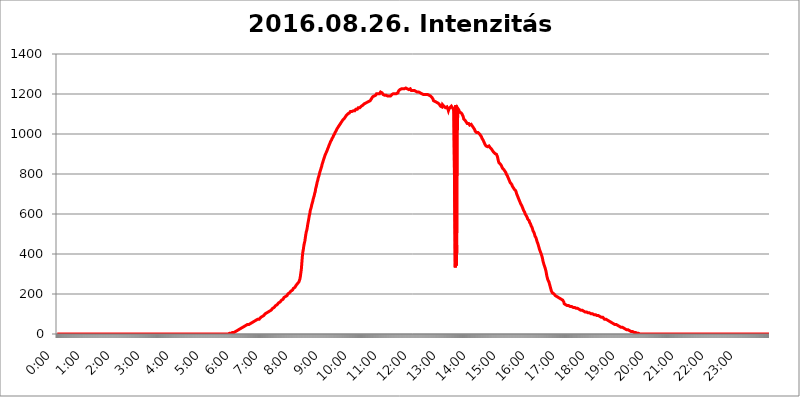
| Category | 2016.08.26. Intenzitás [W/m^2] |
|---|---|
| 0.0 | 0 |
| 0.0006944444444444445 | 0 |
| 0.001388888888888889 | 0 |
| 0.0020833333333333333 | 0 |
| 0.002777777777777778 | 0 |
| 0.003472222222222222 | 0 |
| 0.004166666666666667 | 0 |
| 0.004861111111111111 | 0 |
| 0.005555555555555556 | 0 |
| 0.0062499999999999995 | 0 |
| 0.006944444444444444 | 0 |
| 0.007638888888888889 | 0 |
| 0.008333333333333333 | 0 |
| 0.009027777777777779 | 0 |
| 0.009722222222222222 | 0 |
| 0.010416666666666666 | 0 |
| 0.011111111111111112 | 0 |
| 0.011805555555555555 | 0 |
| 0.012499999999999999 | 0 |
| 0.013194444444444444 | 0 |
| 0.013888888888888888 | 0 |
| 0.014583333333333332 | 0 |
| 0.015277777777777777 | 0 |
| 0.015972222222222224 | 0 |
| 0.016666666666666666 | 0 |
| 0.017361111111111112 | 0 |
| 0.018055555555555557 | 0 |
| 0.01875 | 0 |
| 0.019444444444444445 | 0 |
| 0.02013888888888889 | 0 |
| 0.020833333333333332 | 0 |
| 0.02152777777777778 | 0 |
| 0.022222222222222223 | 0 |
| 0.02291666666666667 | 0 |
| 0.02361111111111111 | 0 |
| 0.024305555555555556 | 0 |
| 0.024999999999999998 | 0 |
| 0.025694444444444447 | 0 |
| 0.02638888888888889 | 0 |
| 0.027083333333333334 | 0 |
| 0.027777777777777776 | 0 |
| 0.02847222222222222 | 0 |
| 0.029166666666666664 | 0 |
| 0.029861111111111113 | 0 |
| 0.030555555555555555 | 0 |
| 0.03125 | 0 |
| 0.03194444444444445 | 0 |
| 0.03263888888888889 | 0 |
| 0.03333333333333333 | 0 |
| 0.034027777777777775 | 0 |
| 0.034722222222222224 | 0 |
| 0.035416666666666666 | 0 |
| 0.036111111111111115 | 0 |
| 0.03680555555555556 | 0 |
| 0.0375 | 0 |
| 0.03819444444444444 | 0 |
| 0.03888888888888889 | 0 |
| 0.03958333333333333 | 0 |
| 0.04027777777777778 | 0 |
| 0.04097222222222222 | 0 |
| 0.041666666666666664 | 0 |
| 0.042361111111111106 | 0 |
| 0.04305555555555556 | 0 |
| 0.043750000000000004 | 0 |
| 0.044444444444444446 | 0 |
| 0.04513888888888889 | 0 |
| 0.04583333333333334 | 0 |
| 0.04652777777777778 | 0 |
| 0.04722222222222222 | 0 |
| 0.04791666666666666 | 0 |
| 0.04861111111111111 | 0 |
| 0.049305555555555554 | 0 |
| 0.049999999999999996 | 0 |
| 0.05069444444444445 | 0 |
| 0.051388888888888894 | 0 |
| 0.052083333333333336 | 0 |
| 0.05277777777777778 | 0 |
| 0.05347222222222222 | 0 |
| 0.05416666666666667 | 0 |
| 0.05486111111111111 | 0 |
| 0.05555555555555555 | 0 |
| 0.05625 | 0 |
| 0.05694444444444444 | 0 |
| 0.057638888888888885 | 0 |
| 0.05833333333333333 | 0 |
| 0.05902777777777778 | 0 |
| 0.059722222222222225 | 0 |
| 0.06041666666666667 | 0 |
| 0.061111111111111116 | 0 |
| 0.06180555555555556 | 0 |
| 0.0625 | 0 |
| 0.06319444444444444 | 0 |
| 0.06388888888888888 | 0 |
| 0.06458333333333334 | 0 |
| 0.06527777777777778 | 0 |
| 0.06597222222222222 | 0 |
| 0.06666666666666667 | 0 |
| 0.06736111111111111 | 0 |
| 0.06805555555555555 | 0 |
| 0.06874999999999999 | 0 |
| 0.06944444444444443 | 0 |
| 0.07013888888888889 | 0 |
| 0.07083333333333333 | 0 |
| 0.07152777777777779 | 0 |
| 0.07222222222222223 | 0 |
| 0.07291666666666667 | 0 |
| 0.07361111111111111 | 0 |
| 0.07430555555555556 | 0 |
| 0.075 | 0 |
| 0.07569444444444444 | 0 |
| 0.0763888888888889 | 0 |
| 0.07708333333333334 | 0 |
| 0.07777777777777778 | 0 |
| 0.07847222222222222 | 0 |
| 0.07916666666666666 | 0 |
| 0.0798611111111111 | 0 |
| 0.08055555555555556 | 0 |
| 0.08125 | 0 |
| 0.08194444444444444 | 0 |
| 0.08263888888888889 | 0 |
| 0.08333333333333333 | 0 |
| 0.08402777777777777 | 0 |
| 0.08472222222222221 | 0 |
| 0.08541666666666665 | 0 |
| 0.08611111111111112 | 0 |
| 0.08680555555555557 | 0 |
| 0.08750000000000001 | 0 |
| 0.08819444444444445 | 0 |
| 0.08888888888888889 | 0 |
| 0.08958333333333333 | 0 |
| 0.09027777777777778 | 0 |
| 0.09097222222222222 | 0 |
| 0.09166666666666667 | 0 |
| 0.09236111111111112 | 0 |
| 0.09305555555555556 | 0 |
| 0.09375 | 0 |
| 0.09444444444444444 | 0 |
| 0.09513888888888888 | 0 |
| 0.09583333333333333 | 0 |
| 0.09652777777777777 | 0 |
| 0.09722222222222222 | 0 |
| 0.09791666666666667 | 0 |
| 0.09861111111111111 | 0 |
| 0.09930555555555555 | 0 |
| 0.09999999999999999 | 0 |
| 0.10069444444444443 | 0 |
| 0.1013888888888889 | 0 |
| 0.10208333333333335 | 0 |
| 0.10277777777777779 | 0 |
| 0.10347222222222223 | 0 |
| 0.10416666666666667 | 0 |
| 0.10486111111111111 | 0 |
| 0.10555555555555556 | 0 |
| 0.10625 | 0 |
| 0.10694444444444444 | 0 |
| 0.1076388888888889 | 0 |
| 0.10833333333333334 | 0 |
| 0.10902777777777778 | 0 |
| 0.10972222222222222 | 0 |
| 0.1111111111111111 | 0 |
| 0.11180555555555556 | 0 |
| 0.11180555555555556 | 0 |
| 0.1125 | 0 |
| 0.11319444444444444 | 0 |
| 0.11388888888888889 | 0 |
| 0.11458333333333333 | 0 |
| 0.11527777777777777 | 0 |
| 0.11597222222222221 | 0 |
| 0.11666666666666665 | 0 |
| 0.1173611111111111 | 0 |
| 0.11805555555555557 | 0 |
| 0.11944444444444445 | 0 |
| 0.12013888888888889 | 0 |
| 0.12083333333333333 | 0 |
| 0.12152777777777778 | 0 |
| 0.12222222222222223 | 0 |
| 0.12291666666666667 | 0 |
| 0.12291666666666667 | 0 |
| 0.12361111111111112 | 0 |
| 0.12430555555555556 | 0 |
| 0.125 | 0 |
| 0.12569444444444444 | 0 |
| 0.12638888888888888 | 0 |
| 0.12708333333333333 | 0 |
| 0.16875 | 0 |
| 0.12847222222222224 | 0 |
| 0.12916666666666668 | 0 |
| 0.12986111111111112 | 0 |
| 0.13055555555555556 | 0 |
| 0.13125 | 0 |
| 0.13194444444444445 | 0 |
| 0.1326388888888889 | 0 |
| 0.13333333333333333 | 0 |
| 0.13402777777777777 | 0 |
| 0.13402777777777777 | 0 |
| 0.13472222222222222 | 0 |
| 0.13541666666666666 | 0 |
| 0.1361111111111111 | 0 |
| 0.13749999999999998 | 0 |
| 0.13819444444444443 | 0 |
| 0.1388888888888889 | 0 |
| 0.13958333333333334 | 0 |
| 0.14027777777777778 | 0 |
| 0.14097222222222222 | 0 |
| 0.14166666666666666 | 0 |
| 0.1423611111111111 | 0 |
| 0.14305555555555557 | 0 |
| 0.14375000000000002 | 0 |
| 0.14444444444444446 | 0 |
| 0.1451388888888889 | 0 |
| 0.1451388888888889 | 0 |
| 0.14652777777777778 | 0 |
| 0.14722222222222223 | 0 |
| 0.14791666666666667 | 0 |
| 0.1486111111111111 | 0 |
| 0.14930555555555555 | 0 |
| 0.15 | 0 |
| 0.15069444444444444 | 0 |
| 0.15138888888888888 | 0 |
| 0.15208333333333332 | 0 |
| 0.15277777777777776 | 0 |
| 0.15347222222222223 | 0 |
| 0.15416666666666667 | 0 |
| 0.15486111111111112 | 0 |
| 0.15555555555555556 | 0 |
| 0.15625 | 0 |
| 0.15694444444444444 | 0 |
| 0.15763888888888888 | 0 |
| 0.15833333333333333 | 0 |
| 0.15902777777777777 | 0 |
| 0.15972222222222224 | 0 |
| 0.16041666666666668 | 0 |
| 0.16111111111111112 | 0 |
| 0.16180555555555556 | 0 |
| 0.1625 | 0 |
| 0.16319444444444445 | 0 |
| 0.1638888888888889 | 0 |
| 0.16458333333333333 | 0 |
| 0.16527777777777777 | 0 |
| 0.16597222222222222 | 0 |
| 0.16666666666666666 | 0 |
| 0.1673611111111111 | 0 |
| 0.16805555555555554 | 0 |
| 0.16874999999999998 | 0 |
| 0.16944444444444443 | 0 |
| 0.17013888888888887 | 0 |
| 0.1708333333333333 | 0 |
| 0.17152777777777775 | 0 |
| 0.17222222222222225 | 0 |
| 0.1729166666666667 | 0 |
| 0.17361111111111113 | 0 |
| 0.17430555555555557 | 0 |
| 0.17500000000000002 | 0 |
| 0.17569444444444446 | 0 |
| 0.1763888888888889 | 0 |
| 0.17708333333333334 | 0 |
| 0.17777777777777778 | 0 |
| 0.17847222222222223 | 0 |
| 0.17916666666666667 | 0 |
| 0.1798611111111111 | 0 |
| 0.18055555555555555 | 0 |
| 0.18125 | 0 |
| 0.18194444444444444 | 0 |
| 0.1826388888888889 | 0 |
| 0.18333333333333335 | 0 |
| 0.1840277777777778 | 0 |
| 0.18472222222222223 | 0 |
| 0.18541666666666667 | 0 |
| 0.18611111111111112 | 0 |
| 0.18680555555555556 | 0 |
| 0.1875 | 0 |
| 0.18819444444444444 | 0 |
| 0.18888888888888888 | 0 |
| 0.18958333333333333 | 0 |
| 0.19027777777777777 | 0 |
| 0.1909722222222222 | 0 |
| 0.19166666666666665 | 0 |
| 0.19236111111111112 | 0 |
| 0.19305555555555554 | 0 |
| 0.19375 | 0 |
| 0.19444444444444445 | 0 |
| 0.1951388888888889 | 0 |
| 0.19583333333333333 | 0 |
| 0.19652777777777777 | 0 |
| 0.19722222222222222 | 0 |
| 0.19791666666666666 | 0 |
| 0.1986111111111111 | 0 |
| 0.19930555555555554 | 0 |
| 0.19999999999999998 | 0 |
| 0.20069444444444443 | 0 |
| 0.20138888888888887 | 0 |
| 0.2020833333333333 | 0 |
| 0.2027777777777778 | 0 |
| 0.2034722222222222 | 0 |
| 0.2041666666666667 | 0 |
| 0.20486111111111113 | 0 |
| 0.20555555555555557 | 0 |
| 0.20625000000000002 | 0 |
| 0.20694444444444446 | 0 |
| 0.2076388888888889 | 0 |
| 0.20833333333333334 | 0 |
| 0.20902777777777778 | 0 |
| 0.20972222222222223 | 0 |
| 0.21041666666666667 | 0 |
| 0.2111111111111111 | 0 |
| 0.21180555555555555 | 0 |
| 0.2125 | 0 |
| 0.21319444444444444 | 0 |
| 0.2138888888888889 | 0 |
| 0.21458333333333335 | 0 |
| 0.2152777777777778 | 0 |
| 0.21597222222222223 | 0 |
| 0.21666666666666667 | 0 |
| 0.21736111111111112 | 0 |
| 0.21805555555555556 | 0 |
| 0.21875 | 0 |
| 0.21944444444444444 | 0 |
| 0.22013888888888888 | 0 |
| 0.22083333333333333 | 0 |
| 0.22152777777777777 | 0 |
| 0.2222222222222222 | 0 |
| 0.22291666666666665 | 0 |
| 0.2236111111111111 | 0 |
| 0.22430555555555556 | 0 |
| 0.225 | 0 |
| 0.22569444444444445 | 0 |
| 0.2263888888888889 | 0 |
| 0.22708333333333333 | 0 |
| 0.22777777777777777 | 0 |
| 0.22847222222222222 | 0 |
| 0.22916666666666666 | 0 |
| 0.2298611111111111 | 0 |
| 0.23055555555555554 | 0 |
| 0.23124999999999998 | 0 |
| 0.23194444444444443 | 0 |
| 0.23263888888888887 | 0 |
| 0.2333333333333333 | 0 |
| 0.2340277777777778 | 0 |
| 0.2347222222222222 | 0 |
| 0.2354166666666667 | 0 |
| 0.23611111111111113 | 0 |
| 0.23680555555555557 | 0 |
| 0.23750000000000002 | 0 |
| 0.23819444444444446 | 0 |
| 0.2388888888888889 | 3.525 |
| 0.23958333333333334 | 0 |
| 0.24027777777777778 | 3.525 |
| 0.24097222222222223 | 3.525 |
| 0.24166666666666667 | 3.525 |
| 0.2423611111111111 | 3.525 |
| 0.24305555555555555 | 3.525 |
| 0.24375 | 3.525 |
| 0.24444444444444446 | 3.525 |
| 0.24513888888888888 | 3.525 |
| 0.24583333333333335 | 7.887 |
| 0.2465277777777778 | 7.887 |
| 0.24722222222222223 | 7.887 |
| 0.24791666666666667 | 7.887 |
| 0.24861111111111112 | 12.257 |
| 0.24930555555555556 | 12.257 |
| 0.25 | 12.257 |
| 0.25069444444444444 | 12.257 |
| 0.2513888888888889 | 12.257 |
| 0.2520833333333333 | 16.636 |
| 0.25277777777777777 | 21.024 |
| 0.2534722222222222 | 21.024 |
| 0.25416666666666665 | 21.024 |
| 0.2548611111111111 | 21.024 |
| 0.2555555555555556 | 25.419 |
| 0.25625000000000003 | 25.419 |
| 0.2569444444444445 | 25.419 |
| 0.2576388888888889 | 29.823 |
| 0.25833333333333336 | 29.823 |
| 0.2590277777777778 | 29.823 |
| 0.25972222222222224 | 34.234 |
| 0.2604166666666667 | 34.234 |
| 0.2611111111111111 | 34.234 |
| 0.26180555555555557 | 38.653 |
| 0.2625 | 38.653 |
| 0.26319444444444445 | 38.653 |
| 0.2638888888888889 | 38.653 |
| 0.26458333333333334 | 43.079 |
| 0.2652777777777778 | 43.079 |
| 0.2659722222222222 | 43.079 |
| 0.26666666666666666 | 47.511 |
| 0.2673611111111111 | 47.511 |
| 0.26805555555555555 | 47.511 |
| 0.26875 | 47.511 |
| 0.26944444444444443 | 51.951 |
| 0.2701388888888889 | 51.951 |
| 0.2708333333333333 | 51.951 |
| 0.27152777777777776 | 56.398 |
| 0.2722222222222222 | 56.398 |
| 0.27291666666666664 | 56.398 |
| 0.2736111111111111 | 56.398 |
| 0.2743055555555555 | 60.85 |
| 0.27499999999999997 | 60.85 |
| 0.27569444444444446 | 60.85 |
| 0.27638888888888885 | 65.31 |
| 0.27708333333333335 | 65.31 |
| 0.2777777777777778 | 65.31 |
| 0.27847222222222223 | 65.31 |
| 0.2791666666666667 | 69.775 |
| 0.2798611111111111 | 69.775 |
| 0.28055555555555556 | 69.775 |
| 0.28125 | 74.246 |
| 0.28194444444444444 | 74.246 |
| 0.2826388888888889 | 74.246 |
| 0.2833333333333333 | 74.246 |
| 0.28402777777777777 | 78.722 |
| 0.2847222222222222 | 78.722 |
| 0.28541666666666665 | 83.205 |
| 0.28611111111111115 | 83.205 |
| 0.28680555555555554 | 87.692 |
| 0.28750000000000003 | 87.692 |
| 0.2881944444444445 | 87.692 |
| 0.2888888888888889 | 92.184 |
| 0.28958333333333336 | 92.184 |
| 0.2902777777777778 | 92.184 |
| 0.29097222222222224 | 96.682 |
| 0.2916666666666667 | 101.184 |
| 0.2923611111111111 | 101.184 |
| 0.29305555555555557 | 101.184 |
| 0.29375 | 105.69 |
| 0.29444444444444445 | 105.69 |
| 0.2951388888888889 | 110.201 |
| 0.29583333333333334 | 110.201 |
| 0.2965277777777778 | 110.201 |
| 0.2972222222222222 | 114.716 |
| 0.29791666666666666 | 114.716 |
| 0.2986111111111111 | 119.235 |
| 0.29930555555555555 | 119.235 |
| 0.3 | 119.235 |
| 0.30069444444444443 | 123.758 |
| 0.3013888888888889 | 123.758 |
| 0.3020833333333333 | 128.284 |
| 0.30277777777777776 | 128.284 |
| 0.3034722222222222 | 132.814 |
| 0.30416666666666664 | 132.814 |
| 0.3048611111111111 | 137.347 |
| 0.3055555555555555 | 137.347 |
| 0.30624999999999997 | 141.884 |
| 0.3069444444444444 | 141.884 |
| 0.3076388888888889 | 146.423 |
| 0.30833333333333335 | 146.423 |
| 0.3090277777777778 | 150.964 |
| 0.30972222222222223 | 150.964 |
| 0.3104166666666667 | 155.509 |
| 0.3111111111111111 | 155.509 |
| 0.31180555555555556 | 160.056 |
| 0.3125 | 160.056 |
| 0.31319444444444444 | 164.605 |
| 0.3138888888888889 | 164.605 |
| 0.3145833333333333 | 169.156 |
| 0.31527777777777777 | 169.156 |
| 0.3159722222222222 | 173.709 |
| 0.31666666666666665 | 173.709 |
| 0.31736111111111115 | 178.264 |
| 0.31805555555555554 | 182.82 |
| 0.31875000000000003 | 182.82 |
| 0.3194444444444445 | 182.82 |
| 0.3201388888888889 | 187.378 |
| 0.32083333333333336 | 191.937 |
| 0.3215277777777778 | 191.937 |
| 0.32222222222222224 | 191.937 |
| 0.3229166666666667 | 196.497 |
| 0.3236111111111111 | 201.058 |
| 0.32430555555555557 | 201.058 |
| 0.325 | 205.62 |
| 0.32569444444444445 | 205.62 |
| 0.3263888888888889 | 210.182 |
| 0.32708333333333334 | 210.182 |
| 0.3277777777777778 | 214.746 |
| 0.3284722222222222 | 214.746 |
| 0.32916666666666666 | 219.309 |
| 0.3298611111111111 | 219.309 |
| 0.33055555555555555 | 223.873 |
| 0.33125 | 228.436 |
| 0.33194444444444443 | 228.436 |
| 0.3326388888888889 | 228.436 |
| 0.3333333333333333 | 233 |
| 0.3340277777777778 | 237.564 |
| 0.3347222222222222 | 242.127 |
| 0.3354166666666667 | 242.127 |
| 0.3361111111111111 | 246.689 |
| 0.3368055555555556 | 251.251 |
| 0.33749999999999997 | 251.251 |
| 0.33819444444444446 | 255.813 |
| 0.33888888888888885 | 260.373 |
| 0.33958333333333335 | 264.932 |
| 0.34027777777777773 | 274.047 |
| 0.34097222222222223 | 287.709 |
| 0.3416666666666666 | 305.898 |
| 0.3423611111111111 | 324.052 |
| 0.3430555555555555 | 355.712 |
| 0.34375 | 387.202 |
| 0.3444444444444445 | 409.574 |
| 0.3451388888888889 | 422.943 |
| 0.3458333333333334 | 440.702 |
| 0.34652777777777777 | 453.968 |
| 0.34722222222222227 | 462.786 |
| 0.34791666666666665 | 480.356 |
| 0.34861111111111115 | 497.836 |
| 0.34930555555555554 | 510.885 |
| 0.35000000000000003 | 519.555 |
| 0.3506944444444444 | 532.513 |
| 0.3513888888888889 | 549.704 |
| 0.3520833333333333 | 562.53 |
| 0.3527777777777778 | 575.299 |
| 0.3534722222222222 | 592.233 |
| 0.3541666666666667 | 600.661 |
| 0.3548611111111111 | 617.436 |
| 0.35555555555555557 | 625.784 |
| 0.35625 | 634.105 |
| 0.35694444444444445 | 646.537 |
| 0.3576388888888889 | 654.791 |
| 0.35833333333333334 | 663.019 |
| 0.3590277777777778 | 675.311 |
| 0.3597222222222222 | 683.473 |
| 0.36041666666666666 | 691.608 |
| 0.3611111111111111 | 703.762 |
| 0.36180555555555555 | 711.832 |
| 0.3625 | 727.896 |
| 0.36319444444444443 | 735.89 |
| 0.3638888888888889 | 747.834 |
| 0.3645833333333333 | 759.723 |
| 0.3652777777777778 | 767.62 |
| 0.3659722222222222 | 779.42 |
| 0.3666666666666667 | 787.258 |
| 0.3673611111111111 | 795.074 |
| 0.3680555555555556 | 806.757 |
| 0.36874999999999997 | 814.519 |
| 0.36944444444444446 | 822.26 |
| 0.37013888888888885 | 829.981 |
| 0.37083333333333335 | 837.682 |
| 0.37152777777777773 | 849.199 |
| 0.37222222222222223 | 856.855 |
| 0.3729166666666666 | 864.493 |
| 0.3736111111111111 | 872.114 |
| 0.3743055555555555 | 879.719 |
| 0.375 | 887.309 |
| 0.3756944444444445 | 894.885 |
| 0.3763888888888889 | 898.668 |
| 0.3770833333333334 | 906.223 |
| 0.37777777777777777 | 909.996 |
| 0.37847222222222227 | 917.534 |
| 0.37916666666666665 | 925.06 |
| 0.37986111111111115 | 928.819 |
| 0.38055555555555554 | 936.33 |
| 0.38125000000000003 | 943.832 |
| 0.3819444444444444 | 947.58 |
| 0.3826388888888889 | 955.071 |
| 0.3833333333333333 | 962.555 |
| 0.3840277777777778 | 966.295 |
| 0.3847222222222222 | 970.034 |
| 0.3854166666666667 | 977.508 |
| 0.3861111111111111 | 981.244 |
| 0.38680555555555557 | 984.98 |
| 0.3875 | 992.448 |
| 0.38819444444444445 | 996.182 |
| 0.3888888888888889 | 999.916 |
| 0.38958333333333334 | 1007.383 |
| 0.3902777777777778 | 1011.118 |
| 0.3909722222222222 | 1014.852 |
| 0.39166666666666666 | 1018.587 |
| 0.3923611111111111 | 1026.06 |
| 0.39305555555555555 | 1029.798 |
| 0.39375 | 1033.537 |
| 0.39444444444444443 | 1037.277 |
| 0.3951388888888889 | 1041.019 |
| 0.3958333333333333 | 1044.762 |
| 0.3965277777777778 | 1048.508 |
| 0.3972222222222222 | 1052.255 |
| 0.3979166666666667 | 1056.004 |
| 0.3986111111111111 | 1059.756 |
| 0.3993055555555556 | 1063.51 |
| 0.39999999999999997 | 1067.267 |
| 0.40069444444444446 | 1071.027 |
| 0.40138888888888885 | 1071.027 |
| 0.40208333333333335 | 1074.789 |
| 0.40277777777777773 | 1078.555 |
| 0.40347222222222223 | 1082.324 |
| 0.4041666666666666 | 1086.097 |
| 0.4048611111111111 | 1089.873 |
| 0.4055555555555555 | 1093.653 |
| 0.40625 | 1097.437 |
| 0.4069444444444445 | 1097.437 |
| 0.4076388888888889 | 1101.226 |
| 0.4083333333333334 | 1101.226 |
| 0.40902777777777777 | 1105.019 |
| 0.40972222222222227 | 1105.019 |
| 0.41041666666666665 | 1108.816 |
| 0.41111111111111115 | 1112.618 |
| 0.41180555555555554 | 1116.426 |
| 0.41250000000000003 | 1112.618 |
| 0.4131944444444444 | 1112.618 |
| 0.4138888888888889 | 1112.618 |
| 0.4145833333333333 | 1112.618 |
| 0.4152777777777778 | 1116.426 |
| 0.4159722222222222 | 1116.426 |
| 0.4166666666666667 | 1116.426 |
| 0.4173611111111111 | 1116.426 |
| 0.41805555555555557 | 1120.238 |
| 0.41875 | 1124.056 |
| 0.41944444444444445 | 1124.056 |
| 0.4201388888888889 | 1124.056 |
| 0.42083333333333334 | 1124.056 |
| 0.4215277777777778 | 1127.879 |
| 0.4222222222222222 | 1131.708 |
| 0.42291666666666666 | 1131.708 |
| 0.4236111111111111 | 1131.708 |
| 0.42430555555555555 | 1131.708 |
| 0.425 | 1131.708 |
| 0.42569444444444443 | 1135.543 |
| 0.4263888888888889 | 1139.384 |
| 0.4270833333333333 | 1139.384 |
| 0.4277777777777778 | 1139.384 |
| 0.4284722222222222 | 1143.232 |
| 0.4291666666666667 | 1147.086 |
| 0.4298611111111111 | 1147.086 |
| 0.4305555555555556 | 1150.946 |
| 0.43124999999999997 | 1150.946 |
| 0.43194444444444446 | 1154.814 |
| 0.43263888888888885 | 1154.814 |
| 0.43333333333333335 | 1154.814 |
| 0.43402777777777773 | 1154.814 |
| 0.43472222222222223 | 1158.689 |
| 0.4354166666666666 | 1158.689 |
| 0.4361111111111111 | 1162.571 |
| 0.4368055555555555 | 1162.571 |
| 0.4375 | 1166.46 |
| 0.4381944444444445 | 1166.46 |
| 0.4388888888888889 | 1166.46 |
| 0.4395833333333334 | 1170.358 |
| 0.44027777777777777 | 1170.358 |
| 0.44097222222222227 | 1178.177 |
| 0.44166666666666665 | 1182.099 |
| 0.44236111111111115 | 1186.03 |
| 0.44305555555555554 | 1186.03 |
| 0.44375000000000003 | 1189.969 |
| 0.4444444444444444 | 1189.969 |
| 0.4451388888888889 | 1189.969 |
| 0.4458333333333333 | 1193.918 |
| 0.4465277777777778 | 1193.918 |
| 0.4472222222222222 | 1197.876 |
| 0.4479166666666667 | 1201.843 |
| 0.4486111111111111 | 1201.843 |
| 0.44930555555555557 | 1201.843 |
| 0.45 | 1201.843 |
| 0.45069444444444445 | 1201.843 |
| 0.4513888888888889 | 1201.843 |
| 0.45208333333333334 | 1201.843 |
| 0.4527777777777778 | 1205.82 |
| 0.4534722222222222 | 1209.807 |
| 0.45416666666666666 | 1209.807 |
| 0.4548611111111111 | 1209.807 |
| 0.45555555555555555 | 1205.82 |
| 0.45625 | 1201.843 |
| 0.45694444444444443 | 1197.876 |
| 0.4576388888888889 | 1197.876 |
| 0.4583333333333333 | 1193.918 |
| 0.4590277777777778 | 1193.918 |
| 0.4597222222222222 | 1189.969 |
| 0.4604166666666667 | 1189.969 |
| 0.4611111111111111 | 1193.918 |
| 0.4618055555555556 | 1189.969 |
| 0.46249999999999997 | 1189.969 |
| 0.46319444444444446 | 1189.969 |
| 0.46388888888888885 | 1189.969 |
| 0.46458333333333335 | 1189.969 |
| 0.46527777777777773 | 1189.969 |
| 0.46597222222222223 | 1189.969 |
| 0.4666666666666666 | 1189.969 |
| 0.4673611111111111 | 1189.969 |
| 0.4680555555555555 | 1189.969 |
| 0.46875 | 1193.918 |
| 0.4694444444444445 | 1197.876 |
| 0.4701388888888889 | 1201.843 |
| 0.4708333333333334 | 1201.843 |
| 0.47152777777777777 | 1201.843 |
| 0.47222222222222227 | 1201.843 |
| 0.47291666666666665 | 1201.843 |
| 0.47361111111111115 | 1201.843 |
| 0.47430555555555554 | 1201.843 |
| 0.47500000000000003 | 1201.843 |
| 0.4756944444444444 | 1201.843 |
| 0.4763888888888889 | 1201.843 |
| 0.4770833333333333 | 1205.82 |
| 0.4777777777777778 | 1205.82 |
| 0.4784722222222222 | 1213.804 |
| 0.4791666666666667 | 1213.804 |
| 0.4798611111111111 | 1217.812 |
| 0.48055555555555557 | 1221.83 |
| 0.48125 | 1225.859 |
| 0.48194444444444445 | 1225.859 |
| 0.4826388888888889 | 1225.859 |
| 0.48333333333333334 | 1229.899 |
| 0.4840277777777778 | 1229.899 |
| 0.4847222222222222 | 1225.859 |
| 0.48541666666666666 | 1225.859 |
| 0.4861111111111111 | 1225.859 |
| 0.48680555555555555 | 1225.859 |
| 0.4875 | 1225.859 |
| 0.48819444444444443 | 1225.859 |
| 0.4888888888888889 | 1229.899 |
| 0.4895833333333333 | 1225.859 |
| 0.4902777777777778 | 1229.899 |
| 0.4909722222222222 | 1225.859 |
| 0.4916666666666667 | 1225.859 |
| 0.4923611111111111 | 1225.859 |
| 0.4930555555555556 | 1221.83 |
| 0.49374999999999997 | 1221.83 |
| 0.49444444444444446 | 1225.859 |
| 0.49513888888888885 | 1225.859 |
| 0.49583333333333335 | 1221.83 |
| 0.49652777777777773 | 1217.812 |
| 0.49722222222222223 | 1217.812 |
| 0.4979166666666666 | 1217.812 |
| 0.4986111111111111 | 1217.812 |
| 0.4993055555555555 | 1217.812 |
| 0.5 | 1217.812 |
| 0.5006944444444444 | 1217.812 |
| 0.5013888888888889 | 1217.812 |
| 0.5020833333333333 | 1217.812 |
| 0.5027777777777778 | 1213.804 |
| 0.5034722222222222 | 1213.804 |
| 0.5041666666666667 | 1209.807 |
| 0.5048611111111111 | 1209.807 |
| 0.5055555555555555 | 1209.807 |
| 0.50625 | 1209.807 |
| 0.5069444444444444 | 1209.807 |
| 0.5076388888888889 | 1209.807 |
| 0.5083333333333333 | 1209.807 |
| 0.5090277777777777 | 1205.82 |
| 0.5097222222222222 | 1205.82 |
| 0.5104166666666666 | 1201.843 |
| 0.5111111111111112 | 1201.843 |
| 0.5118055555555555 | 1197.876 |
| 0.5125000000000001 | 1201.843 |
| 0.5131944444444444 | 1197.876 |
| 0.513888888888889 | 1193.918 |
| 0.5145833333333333 | 1193.918 |
| 0.5152777777777778 | 1197.876 |
| 0.5159722222222222 | 1197.876 |
| 0.5166666666666667 | 1197.876 |
| 0.517361111111111 | 1197.876 |
| 0.5180555555555556 | 1197.876 |
| 0.5187499999999999 | 1201.843 |
| 0.5194444444444445 | 1197.876 |
| 0.5201388888888888 | 1197.876 |
| 0.5208333333333334 | 1193.918 |
| 0.5215277777777778 | 1193.918 |
| 0.5222222222222223 | 1193.918 |
| 0.5229166666666667 | 1189.969 |
| 0.5236111111111111 | 1189.969 |
| 0.5243055555555556 | 1186.03 |
| 0.525 | 1186.03 |
| 0.5256944444444445 | 1182.099 |
| 0.5263888888888889 | 1178.177 |
| 0.5270833333333333 | 1174.263 |
| 0.5277777777777778 | 1166.46 |
| 0.5284722222222222 | 1162.571 |
| 0.5291666666666667 | 1162.571 |
| 0.5298611111111111 | 1162.571 |
| 0.5305555555555556 | 1162.571 |
| 0.53125 | 1158.689 |
| 0.5319444444444444 | 1158.689 |
| 0.5326388888888889 | 1154.814 |
| 0.5333333333333333 | 1154.814 |
| 0.5340277777777778 | 1154.814 |
| 0.5347222222222222 | 1154.814 |
| 0.5354166666666667 | 1154.814 |
| 0.5361111111111111 | 1147.086 |
| 0.5368055555555555 | 1143.232 |
| 0.5375 | 1139.384 |
| 0.5381944444444444 | 1143.232 |
| 0.5388888888888889 | 1139.384 |
| 0.5395833333333333 | 1135.543 |
| 0.5402777777777777 | 1147.086 |
| 0.5409722222222222 | 1147.086 |
| 0.5416666666666666 | 1143.232 |
| 0.5423611111111112 | 1139.384 |
| 0.5430555555555555 | 1139.384 |
| 0.5437500000000001 | 1135.543 |
| 0.5444444444444444 | 1131.708 |
| 0.545138888888889 | 1135.543 |
| 0.5458333333333333 | 1135.543 |
| 0.5465277777777778 | 1135.543 |
| 0.5472222222222222 | 1131.708 |
| 0.5479166666666667 | 1124.056 |
| 0.548611111111111 | 1116.426 |
| 0.5493055555555556 | 1124.056 |
| 0.5499999999999999 | 1127.879 |
| 0.5506944444444445 | 1131.708 |
| 0.5513888888888888 | 1135.543 |
| 0.5520833333333334 | 1135.543 |
| 0.5527777777777778 | 1139.384 |
| 0.5534722222222223 | 1135.543 |
| 0.5541666666666667 | 1131.708 |
| 0.5548611111111111 | 1127.879 |
| 0.5555555555555556 | 1124.056 |
| 0.55625 | 1131.708 |
| 0.5569444444444445 | 1131.708 |
| 0.5576388888888889 | 1131.708 |
| 0.5583333333333333 | 333.113 |
| 0.5590277777777778 | 1143.232 |
| 0.5597222222222222 | 342.162 |
| 0.5604166666666667 | 445.129 |
| 0.5611111111111111 | 1003.65 |
| 0.5618055555555556 | 1127.879 |
| 0.5625 | 1124.056 |
| 0.5631944444444444 | 1120.238 |
| 0.5638888888888889 | 1116.426 |
| 0.5645833333333333 | 1108.816 |
| 0.5652777777777778 | 1108.816 |
| 0.5659722222222222 | 1105.019 |
| 0.5666666666666667 | 1105.019 |
| 0.5673611111111111 | 1101.226 |
| 0.5680555555555555 | 1097.437 |
| 0.56875 | 1093.653 |
| 0.5694444444444444 | 1086.097 |
| 0.5701388888888889 | 1074.789 |
| 0.5708333333333333 | 1074.789 |
| 0.5715277777777777 | 1071.027 |
| 0.5722222222222222 | 1067.267 |
| 0.5729166666666666 | 1063.51 |
| 0.5736111111111112 | 1059.756 |
| 0.5743055555555555 | 1056.004 |
| 0.5750000000000001 | 1052.255 |
| 0.5756944444444444 | 1056.004 |
| 0.576388888888889 | 1052.255 |
| 0.5770833333333333 | 1052.255 |
| 0.5777777777777778 | 1048.508 |
| 0.5784722222222222 | 1044.762 |
| 0.5791666666666667 | 1044.762 |
| 0.579861111111111 | 1048.508 |
| 0.5805555555555556 | 1048.508 |
| 0.5812499999999999 | 1044.762 |
| 0.5819444444444445 | 1041.019 |
| 0.5826388888888888 | 1037.277 |
| 0.5833333333333334 | 1033.537 |
| 0.5840277777777778 | 1029.798 |
| 0.5847222222222223 | 1029.798 |
| 0.5854166666666667 | 1022.323 |
| 0.5861111111111111 | 1014.852 |
| 0.5868055555555556 | 1014.852 |
| 0.5875 | 1014.852 |
| 0.5881944444444445 | 1007.383 |
| 0.5888888888888889 | 1007.383 |
| 0.5895833333333333 | 1007.383 |
| 0.5902777777777778 | 1007.383 |
| 0.5909722222222222 | 1011.118 |
| 0.5916666666666667 | 1003.65 |
| 0.5923611111111111 | 999.916 |
| 0.5930555555555556 | 996.182 |
| 0.59375 | 992.448 |
| 0.5944444444444444 | 988.714 |
| 0.5951388888888889 | 984.98 |
| 0.5958333333333333 | 977.508 |
| 0.5965277777777778 | 977.508 |
| 0.5972222222222222 | 970.034 |
| 0.5979166666666667 | 966.295 |
| 0.5986111111111111 | 958.814 |
| 0.5993055555555555 | 955.071 |
| 0.6 | 947.58 |
| 0.6006944444444444 | 943.832 |
| 0.6013888888888889 | 940.082 |
| 0.6020833333333333 | 940.082 |
| 0.6027777777777777 | 936.33 |
| 0.6034722222222222 | 936.33 |
| 0.6041666666666666 | 940.082 |
| 0.6048611111111112 | 936.33 |
| 0.6055555555555555 | 940.082 |
| 0.6062500000000001 | 936.33 |
| 0.6069444444444444 | 932.576 |
| 0.607638888888889 | 932.576 |
| 0.6083333333333333 | 928.819 |
| 0.6090277777777778 | 925.06 |
| 0.6097222222222222 | 921.298 |
| 0.6104166666666667 | 917.534 |
| 0.611111111111111 | 913.766 |
| 0.6118055555555556 | 909.996 |
| 0.6124999999999999 | 909.996 |
| 0.6131944444444445 | 906.223 |
| 0.6138888888888888 | 902.447 |
| 0.6145833333333334 | 898.668 |
| 0.6152777777777778 | 898.668 |
| 0.6159722222222223 | 898.668 |
| 0.6166666666666667 | 894.885 |
| 0.6173611111111111 | 887.309 |
| 0.6180555555555556 | 875.918 |
| 0.61875 | 864.493 |
| 0.6194444444444445 | 856.855 |
| 0.6201388888888889 | 853.029 |
| 0.6208333333333333 | 853.029 |
| 0.6215277777777778 | 849.199 |
| 0.6222222222222222 | 845.365 |
| 0.6229166666666667 | 841.526 |
| 0.6236111111111111 | 837.682 |
| 0.6243055555555556 | 829.981 |
| 0.625 | 829.981 |
| 0.6256944444444444 | 826.123 |
| 0.6263888888888889 | 822.26 |
| 0.6270833333333333 | 818.392 |
| 0.6277777777777778 | 814.519 |
| 0.6284722222222222 | 810.641 |
| 0.6291666666666667 | 806.757 |
| 0.6298611111111111 | 798.974 |
| 0.6305555555555555 | 795.074 |
| 0.63125 | 791.169 |
| 0.6319444444444444 | 787.258 |
| 0.6326388888888889 | 779.42 |
| 0.6333333333333333 | 775.492 |
| 0.6340277777777777 | 767.62 |
| 0.6347222222222222 | 763.674 |
| 0.6354166666666666 | 755.766 |
| 0.6361111111111112 | 751.803 |
| 0.6368055555555555 | 751.803 |
| 0.6375000000000001 | 747.834 |
| 0.6381944444444444 | 739.877 |
| 0.638888888888889 | 735.89 |
| 0.6395833333333333 | 731.896 |
| 0.6402777777777778 | 727.896 |
| 0.6409722222222222 | 723.889 |
| 0.6416666666666667 | 727.896 |
| 0.642361111111111 | 719.877 |
| 0.6430555555555556 | 715.858 |
| 0.6437499999999999 | 707.8 |
| 0.6444444444444445 | 699.717 |
| 0.6451388888888888 | 695.666 |
| 0.6458333333333334 | 687.544 |
| 0.6465277777777778 | 683.473 |
| 0.6472222222222223 | 675.311 |
| 0.6479166666666667 | 671.22 |
| 0.6486111111111111 | 663.019 |
| 0.6493055555555556 | 658.909 |
| 0.65 | 650.667 |
| 0.6506944444444445 | 646.537 |
| 0.6513888888888889 | 642.4 |
| 0.6520833333333333 | 638.256 |
| 0.6527777777777778 | 629.948 |
| 0.6534722222222222 | 625.784 |
| 0.6541666666666667 | 617.436 |
| 0.6548611111111111 | 613.252 |
| 0.6555555555555556 | 609.062 |
| 0.65625 | 600.661 |
| 0.6569444444444444 | 596.45 |
| 0.6576388888888889 | 592.233 |
| 0.6583333333333333 | 588.009 |
| 0.6590277777777778 | 583.779 |
| 0.6597222222222222 | 575.299 |
| 0.6604166666666667 | 571.049 |
| 0.6611111111111111 | 571.049 |
| 0.6618055555555555 | 566.793 |
| 0.6625 | 558.261 |
| 0.6631944444444444 | 553.986 |
| 0.6638888888888889 | 549.704 |
| 0.6645833333333333 | 541.121 |
| 0.6652777777777777 | 536.82 |
| 0.6659722222222222 | 532.513 |
| 0.6666666666666666 | 523.88 |
| 0.6673611111111111 | 515.223 |
| 0.6680555555555556 | 510.885 |
| 0.6687500000000001 | 506.542 |
| 0.6694444444444444 | 497.836 |
| 0.6701388888888888 | 489.108 |
| 0.6708333333333334 | 484.735 |
| 0.6715277777777778 | 480.356 |
| 0.6722222222222222 | 471.582 |
| 0.6729166666666666 | 462.786 |
| 0.6736111111111112 | 458.38 |
| 0.6743055555555556 | 449.551 |
| 0.6749999999999999 | 440.702 |
| 0.6756944444444444 | 431.833 |
| 0.6763888888888889 | 422.943 |
| 0.6770833333333334 | 418.492 |
| 0.6777777777777777 | 409.574 |
| 0.6784722222222223 | 405.108 |
| 0.6791666666666667 | 396.164 |
| 0.6798611111111111 | 387.202 |
| 0.6805555555555555 | 378.224 |
| 0.68125 | 364.728 |
| 0.6819444444444445 | 355.712 |
| 0.6826388888888889 | 346.682 |
| 0.6833333333333332 | 342.162 |
| 0.6840277777777778 | 333.113 |
| 0.6847222222222222 | 324.052 |
| 0.6854166666666667 | 314.98 |
| 0.686111111111111 | 301.354 |
| 0.6868055555555556 | 287.709 |
| 0.6875 | 278.603 |
| 0.6881944444444444 | 269.49 |
| 0.688888888888889 | 264.932 |
| 0.6895833333333333 | 260.373 |
| 0.6902777777777778 | 251.251 |
| 0.6909722222222222 | 242.127 |
| 0.6916666666666668 | 233 |
| 0.6923611111111111 | 223.873 |
| 0.6930555555555555 | 214.746 |
| 0.69375 | 210.182 |
| 0.6944444444444445 | 205.62 |
| 0.6951388888888889 | 201.058 |
| 0.6958333333333333 | 201.058 |
| 0.6965277777777777 | 201.058 |
| 0.6972222222222223 | 196.497 |
| 0.6979166666666666 | 196.497 |
| 0.6986111111111111 | 191.937 |
| 0.6993055555555556 | 191.937 |
| 0.7000000000000001 | 191.937 |
| 0.7006944444444444 | 187.378 |
| 0.7013888888888888 | 187.378 |
| 0.7020833333333334 | 182.82 |
| 0.7027777777777778 | 182.82 |
| 0.7034722222222222 | 182.82 |
| 0.7041666666666666 | 182.82 |
| 0.7048611111111112 | 178.264 |
| 0.7055555555555556 | 178.264 |
| 0.7062499999999999 | 178.264 |
| 0.7069444444444444 | 173.709 |
| 0.7076388888888889 | 169.156 |
| 0.7083333333333334 | 169.156 |
| 0.7090277777777777 | 169.156 |
| 0.7097222222222223 | 169.156 |
| 0.7104166666666667 | 160.056 |
| 0.7111111111111111 | 150.964 |
| 0.7118055555555555 | 146.423 |
| 0.7125 | 146.423 |
| 0.7131944444444445 | 146.423 |
| 0.7138888888888889 | 141.884 |
| 0.7145833333333332 | 141.884 |
| 0.7152777777777778 | 141.884 |
| 0.7159722222222222 | 141.884 |
| 0.7166666666666667 | 141.884 |
| 0.717361111111111 | 141.884 |
| 0.7180555555555556 | 137.347 |
| 0.71875 | 137.347 |
| 0.7194444444444444 | 137.347 |
| 0.720138888888889 | 137.347 |
| 0.7208333333333333 | 137.347 |
| 0.7215277777777778 | 137.347 |
| 0.7222222222222222 | 137.347 |
| 0.7229166666666668 | 137.347 |
| 0.7236111111111111 | 132.814 |
| 0.7243055555555555 | 132.814 |
| 0.725 | 132.814 |
| 0.7256944444444445 | 132.814 |
| 0.7263888888888889 | 128.284 |
| 0.7270833333333333 | 128.284 |
| 0.7277777777777777 | 128.284 |
| 0.7284722222222223 | 128.284 |
| 0.7291666666666666 | 128.284 |
| 0.7298611111111111 | 128.284 |
| 0.7305555555555556 | 123.758 |
| 0.7312500000000001 | 123.758 |
| 0.7319444444444444 | 123.758 |
| 0.7326388888888888 | 123.758 |
| 0.7333333333333334 | 119.235 |
| 0.7340277777777778 | 119.235 |
| 0.7347222222222222 | 119.235 |
| 0.7354166666666666 | 119.235 |
| 0.7361111111111112 | 119.235 |
| 0.7368055555555556 | 119.235 |
| 0.7374999999999999 | 114.716 |
| 0.7381944444444444 | 114.716 |
| 0.7388888888888889 | 114.716 |
| 0.7395833333333334 | 110.201 |
| 0.7402777777777777 | 110.201 |
| 0.7409722222222223 | 110.201 |
| 0.7416666666666667 | 110.201 |
| 0.7423611111111111 | 110.201 |
| 0.7430555555555555 | 110.201 |
| 0.74375 | 110.201 |
| 0.7444444444444445 | 105.69 |
| 0.7451388888888889 | 105.69 |
| 0.7458333333333332 | 105.69 |
| 0.7465277777777778 | 105.69 |
| 0.7472222222222222 | 105.69 |
| 0.7479166666666667 | 101.184 |
| 0.748611111111111 | 101.184 |
| 0.7493055555555556 | 101.184 |
| 0.75 | 101.184 |
| 0.7506944444444444 | 101.184 |
| 0.751388888888889 | 101.184 |
| 0.7520833333333333 | 101.184 |
| 0.7527777777777778 | 96.682 |
| 0.7534722222222222 | 96.682 |
| 0.7541666666666668 | 96.682 |
| 0.7548611111111111 | 96.682 |
| 0.7555555555555555 | 96.682 |
| 0.75625 | 92.184 |
| 0.7569444444444445 | 92.184 |
| 0.7576388888888889 | 92.184 |
| 0.7583333333333333 | 92.184 |
| 0.7590277777777777 | 92.184 |
| 0.7597222222222223 | 87.692 |
| 0.7604166666666666 | 87.692 |
| 0.7611111111111111 | 87.692 |
| 0.7618055555555556 | 87.692 |
| 0.7625000000000001 | 87.692 |
| 0.7631944444444444 | 83.205 |
| 0.7638888888888888 | 83.205 |
| 0.7645833333333334 | 83.205 |
| 0.7652777777777778 | 83.205 |
| 0.7659722222222222 | 78.722 |
| 0.7666666666666666 | 78.722 |
| 0.7673611111111112 | 74.246 |
| 0.7680555555555556 | 74.246 |
| 0.7687499999999999 | 74.246 |
| 0.7694444444444444 | 74.246 |
| 0.7701388888888889 | 74.246 |
| 0.7708333333333334 | 69.775 |
| 0.7715277777777777 | 69.775 |
| 0.7722222222222223 | 65.31 |
| 0.7729166666666667 | 65.31 |
| 0.7736111111111111 | 65.31 |
| 0.7743055555555555 | 65.31 |
| 0.775 | 60.85 |
| 0.7756944444444445 | 60.85 |
| 0.7763888888888889 | 56.398 |
| 0.7770833333333332 | 56.398 |
| 0.7777777777777778 | 56.398 |
| 0.7784722222222222 | 56.398 |
| 0.7791666666666667 | 51.951 |
| 0.779861111111111 | 51.951 |
| 0.7805555555555556 | 51.951 |
| 0.78125 | 47.511 |
| 0.7819444444444444 | 47.511 |
| 0.782638888888889 | 47.511 |
| 0.7833333333333333 | 47.511 |
| 0.7840277777777778 | 47.511 |
| 0.7847222222222222 | 43.079 |
| 0.7854166666666668 | 43.079 |
| 0.7861111111111111 | 43.079 |
| 0.7868055555555555 | 38.653 |
| 0.7875 | 38.653 |
| 0.7881944444444445 | 38.653 |
| 0.7888888888888889 | 38.653 |
| 0.7895833333333333 | 38.653 |
| 0.7902777777777777 | 34.234 |
| 0.7909722222222223 | 34.234 |
| 0.7916666666666666 | 34.234 |
| 0.7923611111111111 | 34.234 |
| 0.7930555555555556 | 29.823 |
| 0.7937500000000001 | 29.823 |
| 0.7944444444444444 | 29.823 |
| 0.7951388888888888 | 29.823 |
| 0.7958333333333334 | 25.419 |
| 0.7965277777777778 | 25.419 |
| 0.7972222222222222 | 25.419 |
| 0.7979166666666666 | 25.419 |
| 0.7986111111111112 | 21.024 |
| 0.7993055555555556 | 21.024 |
| 0.7999999999999999 | 21.024 |
| 0.8006944444444444 | 21.024 |
| 0.8013888888888889 | 21.024 |
| 0.8020833333333334 | 16.636 |
| 0.8027777777777777 | 16.636 |
| 0.8034722222222223 | 16.636 |
| 0.8041666666666667 | 16.636 |
| 0.8048611111111111 | 12.257 |
| 0.8055555555555555 | 12.257 |
| 0.80625 | 12.257 |
| 0.8069444444444445 | 12.257 |
| 0.8076388888888889 | 12.257 |
| 0.8083333333333332 | 7.887 |
| 0.8090277777777778 | 7.887 |
| 0.8097222222222222 | 7.887 |
| 0.8104166666666667 | 7.887 |
| 0.811111111111111 | 7.887 |
| 0.8118055555555556 | 3.525 |
| 0.8125 | 3.525 |
| 0.8131944444444444 | 3.525 |
| 0.813888888888889 | 3.525 |
| 0.8145833333333333 | 3.525 |
| 0.8152777777777778 | 3.525 |
| 0.8159722222222222 | 3.525 |
| 0.8166666666666668 | 0 |
| 0.8173611111111111 | 0 |
| 0.8180555555555555 | 0 |
| 0.81875 | 0 |
| 0.8194444444444445 | 0 |
| 0.8201388888888889 | 0 |
| 0.8208333333333333 | 0 |
| 0.8215277777777777 | 0 |
| 0.8222222222222223 | 0 |
| 0.8229166666666666 | 0 |
| 0.8236111111111111 | 0 |
| 0.8243055555555556 | 0 |
| 0.8250000000000001 | 0 |
| 0.8256944444444444 | 0 |
| 0.8263888888888888 | 0 |
| 0.8270833333333334 | 0 |
| 0.8277777777777778 | 0 |
| 0.8284722222222222 | 0 |
| 0.8291666666666666 | 0 |
| 0.8298611111111112 | 0 |
| 0.8305555555555556 | 0 |
| 0.8312499999999999 | 0 |
| 0.8319444444444444 | 0 |
| 0.8326388888888889 | 0 |
| 0.8333333333333334 | 0 |
| 0.8340277777777777 | 0 |
| 0.8347222222222223 | 0 |
| 0.8354166666666667 | 0 |
| 0.8361111111111111 | 0 |
| 0.8368055555555555 | 0 |
| 0.8375 | 0 |
| 0.8381944444444445 | 0 |
| 0.8388888888888889 | 0 |
| 0.8395833333333332 | 0 |
| 0.8402777777777778 | 0 |
| 0.8409722222222222 | 0 |
| 0.8416666666666667 | 0 |
| 0.842361111111111 | 0 |
| 0.8430555555555556 | 0 |
| 0.84375 | 0 |
| 0.8444444444444444 | 0 |
| 0.845138888888889 | 0 |
| 0.8458333333333333 | 0 |
| 0.8465277777777778 | 0 |
| 0.8472222222222222 | 0 |
| 0.8479166666666668 | 0 |
| 0.8486111111111111 | 0 |
| 0.8493055555555555 | 0 |
| 0.85 | 0 |
| 0.8506944444444445 | 0 |
| 0.8513888888888889 | 0 |
| 0.8520833333333333 | 0 |
| 0.8527777777777777 | 0 |
| 0.8534722222222223 | 0 |
| 0.8541666666666666 | 0 |
| 0.8548611111111111 | 0 |
| 0.8555555555555556 | 0 |
| 0.8562500000000001 | 0 |
| 0.8569444444444444 | 0 |
| 0.8576388888888888 | 0 |
| 0.8583333333333334 | 0 |
| 0.8590277777777778 | 0 |
| 0.8597222222222222 | 0 |
| 0.8604166666666666 | 0 |
| 0.8611111111111112 | 0 |
| 0.8618055555555556 | 0 |
| 0.8624999999999999 | 0 |
| 0.8631944444444444 | 0 |
| 0.8638888888888889 | 0 |
| 0.8645833333333334 | 0 |
| 0.8652777777777777 | 0 |
| 0.8659722222222223 | 0 |
| 0.8666666666666667 | 0 |
| 0.8673611111111111 | 0 |
| 0.8680555555555555 | 0 |
| 0.86875 | 0 |
| 0.8694444444444445 | 0 |
| 0.8701388888888889 | 0 |
| 0.8708333333333332 | 0 |
| 0.8715277777777778 | 0 |
| 0.8722222222222222 | 0 |
| 0.8729166666666667 | 0 |
| 0.873611111111111 | 0 |
| 0.8743055555555556 | 0 |
| 0.875 | 0 |
| 0.8756944444444444 | 0 |
| 0.876388888888889 | 0 |
| 0.8770833333333333 | 0 |
| 0.8777777777777778 | 0 |
| 0.8784722222222222 | 0 |
| 0.8791666666666668 | 0 |
| 0.8798611111111111 | 0 |
| 0.8805555555555555 | 0 |
| 0.88125 | 0 |
| 0.8819444444444445 | 0 |
| 0.8826388888888889 | 0 |
| 0.8833333333333333 | 0 |
| 0.8840277777777777 | 0 |
| 0.8847222222222223 | 0 |
| 0.8854166666666666 | 0 |
| 0.8861111111111111 | 0 |
| 0.8868055555555556 | 0 |
| 0.8875000000000001 | 0 |
| 0.8881944444444444 | 0 |
| 0.8888888888888888 | 0 |
| 0.8895833333333334 | 0 |
| 0.8902777777777778 | 0 |
| 0.8909722222222222 | 0 |
| 0.8916666666666666 | 0 |
| 0.8923611111111112 | 0 |
| 0.8930555555555556 | 0 |
| 0.8937499999999999 | 0 |
| 0.8944444444444444 | 0 |
| 0.8951388888888889 | 0 |
| 0.8958333333333334 | 0 |
| 0.8965277777777777 | 0 |
| 0.8972222222222223 | 0 |
| 0.8979166666666667 | 0 |
| 0.8986111111111111 | 0 |
| 0.8993055555555555 | 0 |
| 0.9 | 0 |
| 0.9006944444444445 | 0 |
| 0.9013888888888889 | 0 |
| 0.9020833333333332 | 0 |
| 0.9027777777777778 | 0 |
| 0.9034722222222222 | 0 |
| 0.9041666666666667 | 0 |
| 0.904861111111111 | 0 |
| 0.9055555555555556 | 0 |
| 0.90625 | 0 |
| 0.9069444444444444 | 0 |
| 0.907638888888889 | 0 |
| 0.9083333333333333 | 0 |
| 0.9090277777777778 | 0 |
| 0.9097222222222222 | 0 |
| 0.9104166666666668 | 0 |
| 0.9111111111111111 | 0 |
| 0.9118055555555555 | 0 |
| 0.9125 | 0 |
| 0.9131944444444445 | 0 |
| 0.9138888888888889 | 0 |
| 0.9145833333333333 | 0 |
| 0.9152777777777777 | 0 |
| 0.9159722222222223 | 0 |
| 0.9166666666666666 | 0 |
| 0.9173611111111111 | 0 |
| 0.9180555555555556 | 0 |
| 0.9187500000000001 | 0 |
| 0.9194444444444444 | 0 |
| 0.9201388888888888 | 0 |
| 0.9208333333333334 | 0 |
| 0.9215277777777778 | 0 |
| 0.9222222222222222 | 0 |
| 0.9229166666666666 | 0 |
| 0.9236111111111112 | 0 |
| 0.9243055555555556 | 0 |
| 0.9249999999999999 | 0 |
| 0.9256944444444444 | 0 |
| 0.9263888888888889 | 0 |
| 0.9270833333333334 | 0 |
| 0.9277777777777777 | 0 |
| 0.9284722222222223 | 0 |
| 0.9291666666666667 | 0 |
| 0.9298611111111111 | 0 |
| 0.9305555555555555 | 0 |
| 0.93125 | 0 |
| 0.9319444444444445 | 0 |
| 0.9326388888888889 | 0 |
| 0.9333333333333332 | 0 |
| 0.9340277777777778 | 0 |
| 0.9347222222222222 | 0 |
| 0.9354166666666667 | 0 |
| 0.936111111111111 | 0 |
| 0.9368055555555556 | 0 |
| 0.9375 | 0 |
| 0.9381944444444444 | 0 |
| 0.938888888888889 | 0 |
| 0.9395833333333333 | 0 |
| 0.9402777777777778 | 0 |
| 0.9409722222222222 | 0 |
| 0.9416666666666668 | 0 |
| 0.9423611111111111 | 0 |
| 0.9430555555555555 | 0 |
| 0.94375 | 0 |
| 0.9444444444444445 | 0 |
| 0.9451388888888889 | 0 |
| 0.9458333333333333 | 0 |
| 0.9465277777777777 | 0 |
| 0.9472222222222223 | 0 |
| 0.9479166666666666 | 0 |
| 0.9486111111111111 | 0 |
| 0.9493055555555556 | 0 |
| 0.9500000000000001 | 0 |
| 0.9506944444444444 | 0 |
| 0.9513888888888888 | 0 |
| 0.9520833333333334 | 0 |
| 0.9527777777777778 | 0 |
| 0.9534722222222222 | 0 |
| 0.9541666666666666 | 0 |
| 0.9548611111111112 | 0 |
| 0.9555555555555556 | 0 |
| 0.9562499999999999 | 0 |
| 0.9569444444444444 | 0 |
| 0.9576388888888889 | 0 |
| 0.9583333333333334 | 0 |
| 0.9590277777777777 | 0 |
| 0.9597222222222223 | 0 |
| 0.9604166666666667 | 0 |
| 0.9611111111111111 | 0 |
| 0.9618055555555555 | 0 |
| 0.9625 | 0 |
| 0.9631944444444445 | 0 |
| 0.9638888888888889 | 0 |
| 0.9645833333333332 | 0 |
| 0.9652777777777778 | 0 |
| 0.9659722222222222 | 0 |
| 0.9666666666666667 | 0 |
| 0.967361111111111 | 0 |
| 0.9680555555555556 | 0 |
| 0.96875 | 0 |
| 0.9694444444444444 | 0 |
| 0.970138888888889 | 0 |
| 0.9708333333333333 | 0 |
| 0.9715277777777778 | 0 |
| 0.9722222222222222 | 0 |
| 0.9729166666666668 | 0 |
| 0.9736111111111111 | 0 |
| 0.9743055555555555 | 0 |
| 0.975 | 0 |
| 0.9756944444444445 | 0 |
| 0.9763888888888889 | 0 |
| 0.9770833333333333 | 0 |
| 0.9777777777777777 | 0 |
| 0.9784722222222223 | 0 |
| 0.9791666666666666 | 0 |
| 0.9798611111111111 | 0 |
| 0.9805555555555556 | 0 |
| 0.9812500000000001 | 0 |
| 0.9819444444444444 | 0 |
| 0.9826388888888888 | 0 |
| 0.9833333333333334 | 0 |
| 0.9840277777777778 | 0 |
| 0.9847222222222222 | 0 |
| 0.9854166666666666 | 0 |
| 0.9861111111111112 | 0 |
| 0.9868055555555556 | 0 |
| 0.9874999999999999 | 0 |
| 0.9881944444444444 | 0 |
| 0.9888888888888889 | 0 |
| 0.9895833333333334 | 0 |
| 0.9902777777777777 | 0 |
| 0.9909722222222223 | 0 |
| 0.9916666666666667 | 0 |
| 0.9923611111111111 | 0 |
| 0.9930555555555555 | 0 |
| 0.99375 | 0 |
| 0.9944444444444445 | 0 |
| 0.9951388888888889 | 0 |
| 0.9958333333333332 | 0 |
| 0.9965277777777778 | 0 |
| 0.9972222222222222 | 0 |
| 0.9979166666666667 | 0 |
| 0.998611111111111 | 0 |
| 0.9993055555555556 | 0 |